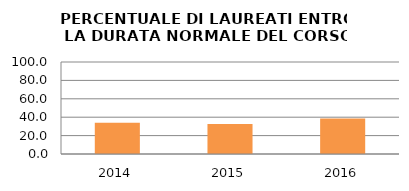
| Category | 2014 2015 2016 |
|---|---|
| 2014.0 | 33.962 |
| 2015.0 | 32.609 |
| 2016.0 | 38.462 |